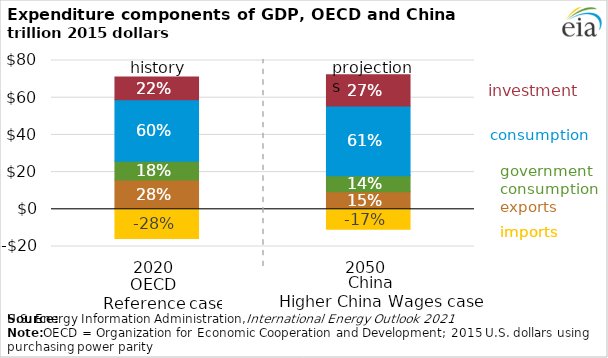
| Category | Exports | Government consumption | Imports | Personal consumption | Investment |
|---|---|---|---|---|---|
| 2020.0 | 15699.31 | 10100.15 | -15691.45 | 33043.44 | 12308.11 |
| 2050.0 | 9478.754 | 8608.573 | -10664.81 | 37504.75 | 16734.48 |